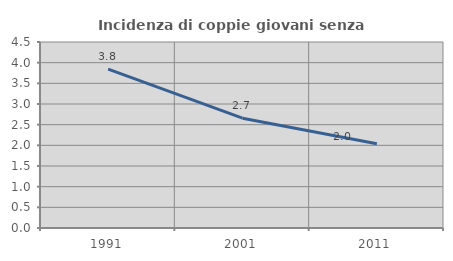
| Category | Incidenza di coppie giovani senza figli |
|---|---|
| 1991.0 | 3.842 |
| 2001.0 | 2.657 |
| 2011.0 | 2.04 |